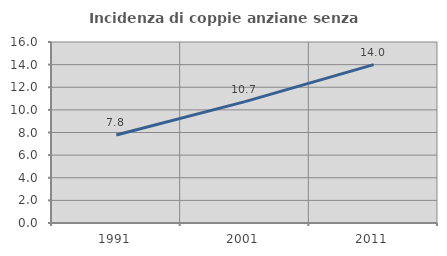
| Category | Incidenza di coppie anziane senza figli  |
|---|---|
| 1991.0 | 7.783 |
| 2001.0 | 10.726 |
| 2011.0 | 13.998 |